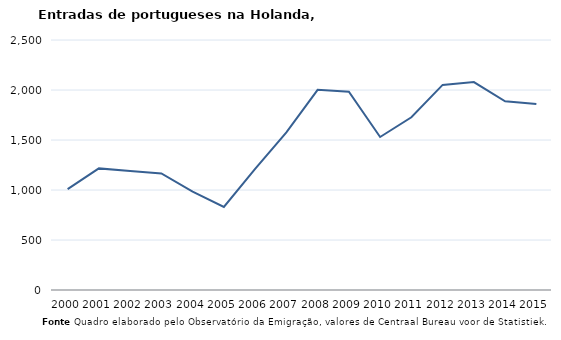
| Category | Entradas |
|---|---|
| 2000.0 | 1009 |
| 2001.0 | 1216 |
| 2002.0 | 1189 |
| 2003.0 | 1166 |
| 2004.0 | 984 |
| 2005.0 | 830 |
| 2006.0 | 1211 |
| 2007.0 | 1577 |
| 2008.0 | 2002 |
| 2009.0 | 1983 |
| 2010.0 | 1530 |
| 2011.0 | 1727 |
| 2012.0 | 2051 |
| 2013.0 | 2079 |
| 2014.0 | 1887 |
| 2015.0 | 1860 |